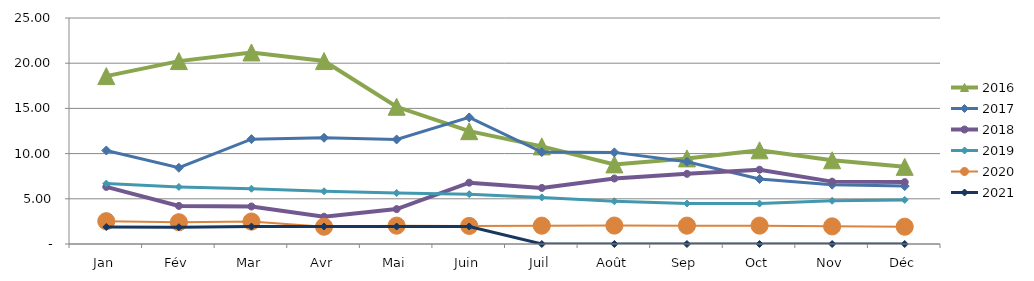
| Category | 2015 | 2016 | 2017 | 2018 | 2019 | 2020 | 2021 |
|---|---|---|---|---|---|---|---|
| Jan |  | 18.573 | 10.345 | 6.315 | 6.68 | 2.521 | 1.881 |
| Fév |  | 20.232 | 8.433 | 4.213 | 6.315 | 2.407 | 1.859 |
| Mar |  | 21.188 | 11.601 | 4.15 | 6.109 | 2.483 | 1.927 |
| Avr |  | 20.238 | 11.751 | 3.014 | 5.832 | 1.915 | 1.933 |
| Mai |  | 15.18 | 11.565 | 3.859 | 5.648 | 2.029 | 1.933 |
| Juin |  | 12.479 | 14.003 | 6.784 | 5.512 | 2.001 | 1.94 |
| Juil |  | 10.799 | 10.166 | 6.203 | 5.152 | 2.027 | 0 |
| Août |  | 8.807 | 10.134 | 7.245 | 4.728 | 2.036 | 0 |
| Sep |  | 9.47 | 9.094 | 7.761 | 4.477 | 2.029 | 0 |
| Oct |  | 10.362 | 7.192 | 8.218 | 4.47 | 2.032 | 0 |
| Nov |  | 9.261 | 6.564 | 6.9 | 4.782 | 1.95 | 0 |
| Déc |  | 8.534 | 6.409 | 6.846 | 4.875 | 1.91 | 0 |